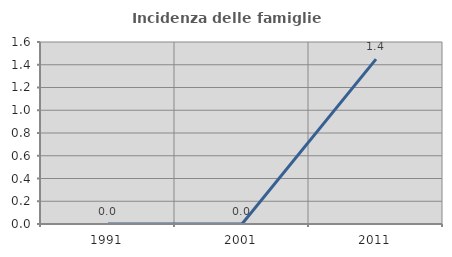
| Category | Incidenza delle famiglie numerose |
|---|---|
| 1991.0 | 0 |
| 2001.0 | 0 |
| 2011.0 | 1.449 |